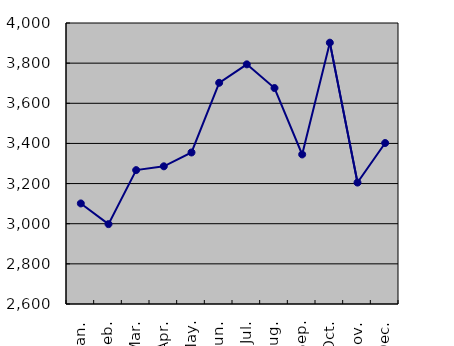
| Category | Series 0 |
|---|---|
| Jan. | 3101 |
| Feb. | 2998 |
| Mar. | 3267 |
| Apr. | 3286 |
| May. | 3355 |
| Jun. | 3702 |
| Jul. | 3794 |
| Aug. | 3676 |
| Sep. | 3345 |
| Oct. | 3902 |
| Nov. | 3205 |
| Dec. | 3402 |